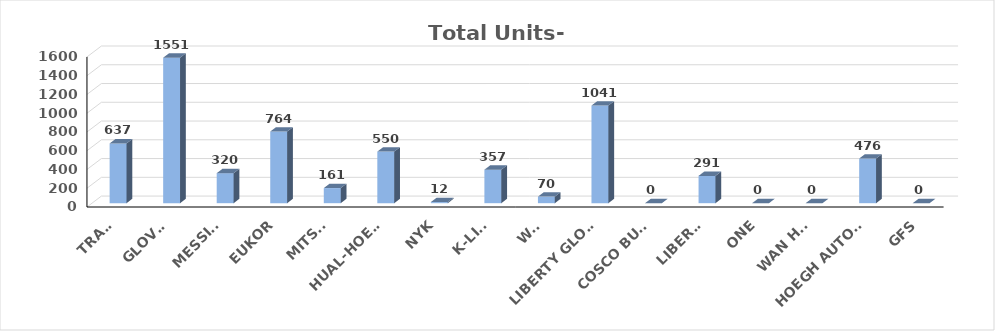
| Category | Series 0 |
|---|---|
| TRAMP | 637 |
| GLOVIS | 1551 |
| MESSINA | 320 |
| EUKOR | 764 |
| MITSUI | 161 |
| HUAL-HOEGH | 550 |
| NYK | 12 |
| K-LINE | 357 |
| WWL | 70 |
| LIBERTY GLOBA | 1041 |
| COSCO BULK | 0 |
| LIBERTY | 291 |
| ONE | 0 |
| WAN HAI | 0 |
| HOEGH AUTOLIN | 476 |
| GFS | 0 |